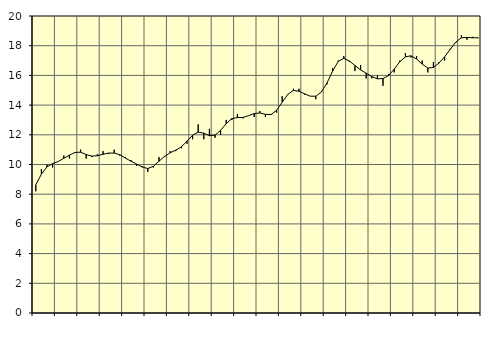
| Category | Piggar | Series 1 |
|---|---|---|
| nan | 8.2 | 8.64 |
| 1.0 | 9.7 | 9.35 |
| 1.0 | 10 | 9.84 |
| 1.0 | 9.8 | 10.06 |
| nan | 10.2 | 10.2 |
| 2.0 | 10.6 | 10.42 |
| 2.0 | 10.4 | 10.63 |
| 2.0 | 10.8 | 10.81 |
| nan | 11 | 10.83 |
| 3.0 | 10.4 | 10.67 |
| 3.0 | 10.5 | 10.57 |
| 3.0 | 10.7 | 10.59 |
| nan | 10.9 | 10.69 |
| 4.0 | 10.7 | 10.77 |
| 4.0 | 11 | 10.77 |
| 4.0 | 10.6 | 10.66 |
| nan | 10.5 | 10.43 |
| 5.0 | 10.3 | 10.22 |
| 5.0 | 9.9 | 10.03 |
| 5.0 | 9.9 | 9.83 |
| nan | 9.5 | 9.73 |
| 6.0 | 9.8 | 9.88 |
| 6.0 | 10.5 | 10.22 |
| 6.0 | 10.5 | 10.55 |
| nan | 10.9 | 10.79 |
| 7.0 | 10.9 | 10.97 |
| 7.0 | 11.1 | 11.19 |
| 7.0 | 11.4 | 11.57 |
| nan | 11.7 | 11.97 |
| 8.0 | 12.7 | 12.18 |
| 8.0 | 11.7 | 12.11 |
| 8.0 | 12.4 | 11.94 |
| nan | 11.8 | 11.98 |
| 9.0 | 12 | 12.3 |
| 9.0 | 13 | 12.75 |
| 9.0 | 13 | 13.09 |
| nan | 13.4 | 13.16 |
| 10.0 | 13.1 | 13.17 |
| 10.0 | 13.3 | 13.29 |
| 10.0 | 13.2 | 13.43 |
| nan | 13.6 | 13.47 |
| 11.0 | 13.2 | 13.38 |
| 11.0 | 13.4 | 13.36 |
| 11.0 | 13.5 | 13.65 |
| nan | 14.6 | 14.19 |
| 12.0 | 14.7 | 14.72 |
| 12.0 | 15.1 | 14.99 |
| 12.0 | 15.1 | 14.93 |
| nan | 14.7 | 14.76 |
| 13.0 | 14.6 | 14.6 |
| 13.0 | 14.4 | 14.6 |
| 13.0 | 14.9 | 14.88 |
| nan | 15.4 | 15.49 |
| 14.0 | 16.5 | 16.29 |
| 14.0 | 17 | 16.94 |
| 14.0 | 17.3 | 17.15 |
| nan | 16.9 | 16.97 |
| 15.0 | 16.3 | 16.66 |
| 15.0 | 16.7 | 16.37 |
| 15.0 | 15.8 | 16.15 |
| nan | 15.8 | 15.92 |
| 16.0 | 16 | 15.77 |
| 16.0 | 15.3 | 15.79 |
| 16.0 | 16.1 | 15.99 |
| nan | 16.2 | 16.42 |
| 17.0 | 17 | 16.92 |
| 17.0 | 17.5 | 17.25 |
| 17.0 | 17.2 | 17.32 |
| nan | 17.3 | 17.1 |
| 18.0 | 17 | 16.76 |
| 18.0 | 16.2 | 16.5 |
| 18.0 | 16.9 | 16.53 |
| nan | 16.9 | 16.83 |
| 19.0 | 17 | 17.25 |
| 19.0 | 17.8 | 17.75 |
| 19.0 | 18.2 | 18.25 |
| nan | 18.7 | 18.53 |
| 20.0 | 18.4 | 18.56 |
| 20.0 | 18.6 | 18.53 |
| 20.0 | 18.5 | 18.54 |